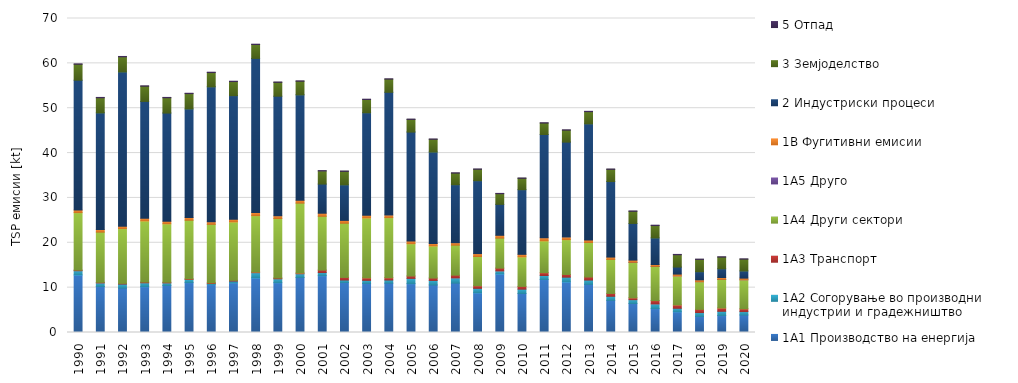
| Category | 1A1 Производство на енергија | 1A2 Согорување во производни индустрии и градежништво | 1A3 Транспорт | 1A4 Други сектори | 1A5 Друго | 1B Фугитивни емисии | 2 Индустриски процеси | 3 Земјоделство | 5 Отпад |
|---|---|---|---|---|---|---|---|---|---|
| 1990 | 12.82 | 0.948 | 0.136 | 12.817 | 0 | 0.564 | 28.957 | 3.56 | 0.078 |
| 1991 | 10.264 | 0.783 | 0.143 | 11.186 | 0 | 0.588 | 26.002 | 3.362 | 0.077 |
| 1992 | 9.889 | 0.906 | 0.157 | 12.205 | 0 | 0.54 | 34.396 | 3.367 | 0.077 |
| 1993 | 10.21 | 0.866 | 0.163 | 13.628 | 0 | 0.584 | 26.065 | 3.39 | 0.077 |
| 1994 | 10.492 | 0.564 | 0.146 | 13.019 | 0 | 0.565 | 24.129 | 3.414 | 0.077 |
| 1995 | 11.122 | 0.698 | 0.163 | 13.043 | 0 | 0.596 | 24.227 | 3.405 | 0.076 |
| 1996 | 10.673 | 0.252 | 0.165 | 13.021 | 0 | 0.597 | 30.06 | 3.18 | 0.077 |
| 1997 | 11.07 | 0.396 | 0.168 | 13.007 | 0 | 0.616 | 27.551 | 3.128 | 0.075 |
| 1998 | 12.159 | 1.171 | 0.17 | 12.549 | 0 | 0.68 | 34.377 | 3.089 | 0.074 |
| 1999 | 11.096 | 0.876 | 0.171 | 13.258 | 0 | 0.609 | 26.669 | 3.083 | 0.074 |
| 2000 | 12.274 | 0.815 | 0.181 | 15.57 | 0 | 0.633 | 23.508 | 3.038 | 0.072 |
| 2001 | 12.663 | 0.703 | 0.541 | 11.998 | 0 | 0.684 | 6.501 | 2.921 | 0.075 |
| 2002 | 11.149 | 0.549 | 0.583 | 12.079 | 0 | 0.631 | 7.932 | 2.997 | 0.072 |
| 2003 | 10.943 | 0.686 | 0.559 | 13.341 | 0 | 0.609 | 22.852 | 2.95 | 0.071 |
| 2004 | 10.992 | 0.706 | 0.514 | 13.391 | 0 | 0.614 | 27.335 | 2.927 | 0.071 |
| 2005 | 10.888 | 1.173 | 0.531 | 7.203 | 0 | 0.579 | 24.303 | 2.822 | 0.07 |
| 2006 | 10.586 | 1.021 | 0.531 | 7.152 | 0 | 0.561 | 20.388 | 2.831 | 0.069 |
| 2007 | 11.007 | 1.163 | 0.61 | 6.691 | 0 | 0.551 | 12.931 | 2.574 | 0.068 |
| 2008 | 8.843 | 0.998 | 0.591 | 6.516 | 0 | 0.643 | 16.255 | 2.541 | 0.068 |
| 2009 | 13.043 | 0.681 | 0.625 | 6.694 | 0 | 0.624 | 6.899 | 2.375 | 0.068 |
| 2010 | 8.69 | 0.967 | 0.619 | 6.584 | 0 | 0.565 | 14.414 | 2.532 | 0.067 |
| 2011 | 11.804 | 0.902 | 0.632 | 7.091 | 0 | 0.684 | 23.03 | 2.543 | 0.071 |
| 2012 | 11.266 | 1.068 | 0.604 | 7.763 | 0 | 0.604 | 21.135 | 2.665 | 0.072 |
| 2013 | 10.727 | 0.963 | 0.676 | 7.698 | 0 | 0.549 | 25.902 | 2.716 | 0.073 |
| 2014 | 7.158 | 0.913 | 0.636 | 7.575 | 0 | 0.532 | 16.84 | 2.713 | 0.073 |
| 2015 | 6.47 | 0.845 | 0.418 | 7.912 | 0.001 | 0.487 | 8.18 | 2.704 | 0.077 |
| 2016 | 5.321 | 1.044 | 0.746 | 7.628 | 0.002 | 0.422 | 5.924 | 2.754 | 0.078 |
| 2017 | 4.613 | 0.785 | 0.756 | 6.448 | 0.001 | 0.418 | 1.564 | 2.744 | 0.079 |
| 2018 | 3.586 | 0.855 | 0.719 | 6.16 | 0.001 | 0.41 | 1.82 | 2.738 | 0.062 |
| 2019 | 3.778 | 0.947 | 0.749 | 6.367 | 0.001 | 0.415 | 1.951 | 2.602 | 0.062 |
| 2020 | 3.897 | 0.764 | 0.625 | 6.461 | 0.001 | 0.372 | 1.602 | 2.625 | 0.062 |